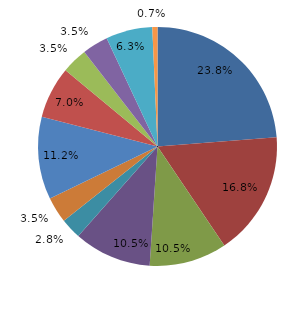
| Category | Series 0 |
|---|---|
| قبل الدخول | 23.776 |
| -1 | 16.783 |
| 1 | 10.49 |
| 2 | 10.49 |
| 3 | 2.797 |
| 4 | 3.497 |
|  5 - 9 | 11.189 |
|  10 - 14 | 6.993 |
|  15 - 19 | 3.497 |
|  20 - 24 | 3.497 |
| 25 + | 6.294 |
| غير مبين | 0.699 |